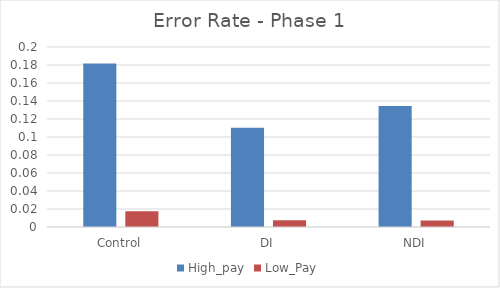
| Category | High_pay | Low_Pay |
|---|---|---|
| Control | 0.182 | 0.018 |
| DI | 0.11 | 0.008 |
| NDI | 0.135 | 0.007 |